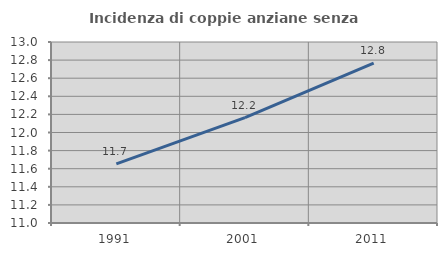
| Category | Incidenza di coppie anziane senza figli  |
|---|---|
| 1991.0 | 11.654 |
| 2001.0 | 12.165 |
| 2011.0 | 12.768 |